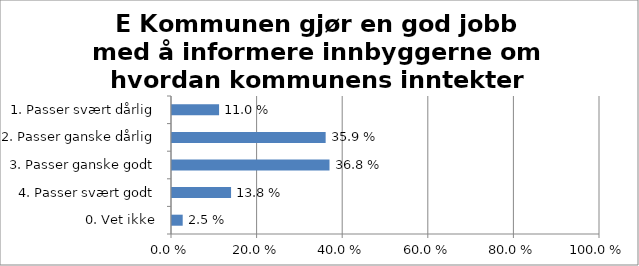
| Category | E Kommunen gjør en god jobb med å informere innbyggerne om hvordan kommunens inntekter brukes |
|---|---|
| 1. Passer svært dårlig | 0.11 |
| 2. Passer ganske dårlig | 0.359 |
| 3. Passer ganske godt | 0.368 |
| 4. Passer svært godt | 0.138 |
| 0. Vet ikke | 0.025 |